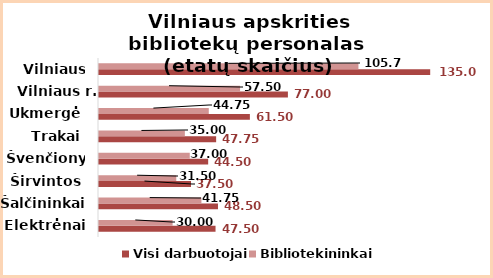
| Category | Visi darbuotojai | Bibliotekininkai |
|---|---|---|
| Elektrėnai | 47.5 | 30 |
| Šalčininkai | 48.5 | 41.75 |
| Širvintos | 37.5 | 31.5 |
| Švenčionys | 44.5 | 37 |
| Trakai | 47.75 | 35 |
| Ukmergė | 61.5 | 44.75 |
| Vilniaus r. | 77 | 57.5 |
| Vilniaus m. | 135 | 105.75 |